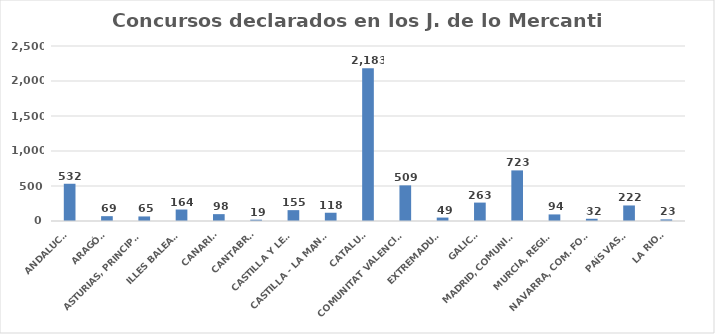
| Category | Series 0 |
|---|---|
| ANDALUCÍA | 532 |
| ARAGÓN | 69 |
| ASTURIAS, PRINCIPADO | 65 |
| ILLES BALEARS | 164 |
| CANARIAS | 98 |
| CANTABRIA | 19 |
| CASTILLA Y LEÓN | 155 |
| CASTILLA - LA MANCHA | 118 |
| CATALUÑA | 2183 |
| COMUNITAT VALENCIANA | 509 |
| EXTREMADURA | 49 |
| GALICIA | 263 |
| MADRID, COMUNIDAD | 723 |
| MURCIA, REGIÓN | 94 |
| NAVARRA, COM. FORAL | 32 |
| PAÍS VASCO | 222 |
| LA RIOJA | 23 |